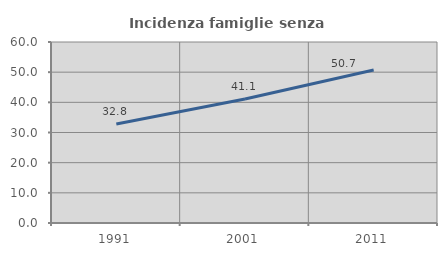
| Category | Incidenza famiglie senza nuclei |
|---|---|
| 1991.0 | 32.836 |
| 2001.0 | 41.085 |
| 2011.0 | 50.712 |